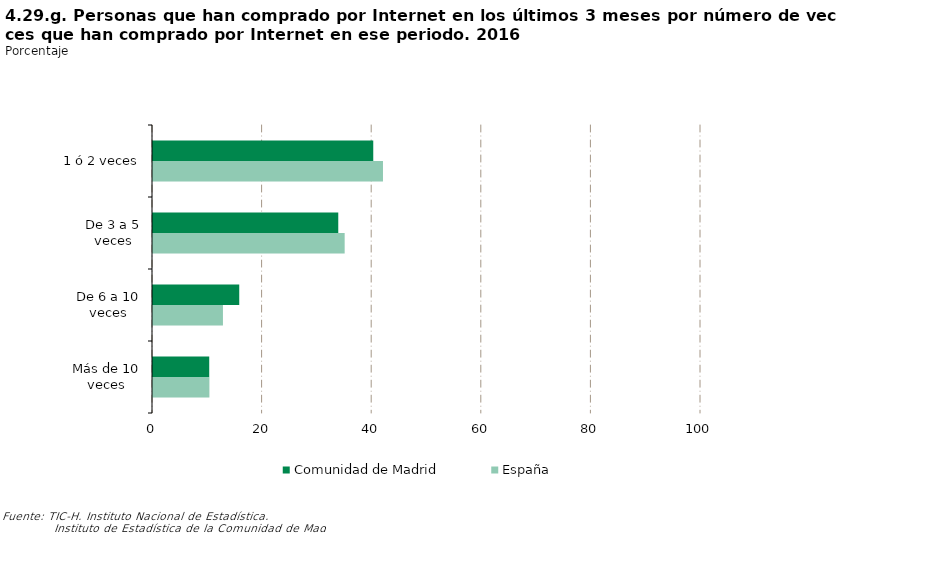
| Category | Comunidad de Madrid | España |
|---|---|---|
| 1 ó 2 veces | 40.192 | 41.967 |
| De 3 a 5 veces | 33.808 | 34.976 |
| De 6 a 10 veces | 15.738 | 12.763 |
| Más de 10 veces | 10.261 | 10.294 |